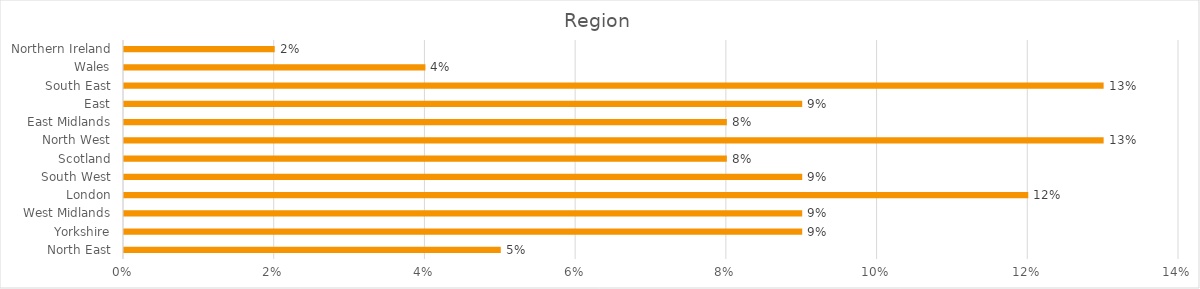
| Category | Region |
|---|---|
| North East | 0.05 |
| Yorkshire | 0.09 |
| West Midlands | 0.09 |
| London | 0.12 |
| South West | 0.09 |
| Scotland | 0.08 |
| North West | 0.13 |
| East Midlands | 0.08 |
| East | 0.09 |
| South East | 0.13 |
| Wales | 0.04 |
| Northern Ireland | 0.02 |